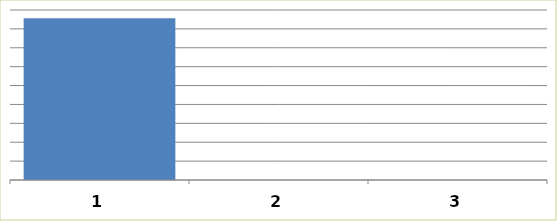
| Category | Series 0 |
|---|---|
| 0 | 1712162 |
| 1 | 0 |
| 2 | 0 |